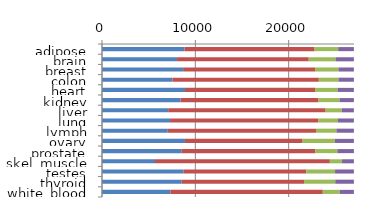
| Category | Similar | Not present | Variable | Switch |
|---|---|---|---|---|
| adipose | 8834 | 13946 | 2527 | 1682 |
| brain | 8043 | 14106 | 2871 | 1969 |
| breast | 8694 | 14128 | 2511 | 1656 |
| colon | 7564 | 15667 | 2103 | 1655 |
| heart | 8895 | 13931 | 2416 | 1747 |
| kidney | 8428 | 14775 | 2245 | 1541 |
| liver | 7092 | 16872 | 1706 | 1319 |
| lung | 7295 | 15895 | 2093 | 1706 |
| lymph | 7048 | 15879 | 2191 | 1871 |
| ovary | 8888 | 12608 | 3446 | 2047 |
| prostate | 8496 | 14374 | 2347 | 1772 |
| skel_muscle | 5679 | 18731 | 1310 | 1269 |
| testes | 8722 | 13168 | 3081 | 2018 |
| thyroid | 8539 | 13111 | 3340 | 1999 |
| white_blood | 7327 | 16328 | 1814 | 1520 |